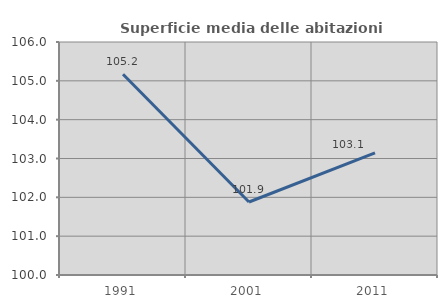
| Category | Superficie media delle abitazioni occupate |
|---|---|
| 1991.0 | 105.169 |
| 2001.0 | 101.879 |
| 2011.0 | 103.147 |